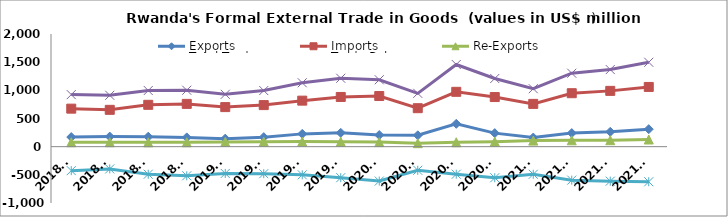
| Category | Exports | Imports | Re-Exports | Total Trade | Trade Balance |
|---|---|---|---|---|---|
| 2018Q1 | 170.799 | 674.777 | 78.5 | 924.075 | -425.479 |
| 2018Q2 | 179.196 | 653.691 | 79.205 | 912.093 | -395.289 |
| 2018Q3 | 176.56 | 742.86 | 77.118 | 996.538 | -489.182 |
| 2018Q4 | 164.223 | 759.496 | 78.239 | 1001.958 | -517.034 |
| 2019Q1 | 142.226 | 702.457 | 84.537 | 929.22 | -475.694 |
| 2019Q2 | 168.991 | 737.888 | 89.17 | 996.048 | -479.727 |
| 2019Q3 | 226.991 | 816.871 | 90.481 | 1134.343 | -499.399 |
| 2019Q4 | 244.881 | 882.342 | 86.987 | 1214.21 | -550.474 |
| 2020Q1 | 206.757 | 898.996 | 81.633 | 1187.386 | -610.606 |
| 2020Q2 | 201.77 | 682.838 | 62.103 | 946.711 | -418.965 |
| 2020Q3 | 405.953 | 973.662 | 78.856 | 1458.471 | -488.853 |
| 2020Q4 | 240.244 | 880.636 | 89.074 | 1209.954 | -551.318 |
| 2021Q1 | 161.83 | 759.383 | 107.52 | 1028.733 | -490.033 |
| 2021Q2 | 241.484 | 948.948 | 113.328 | 1303.761 | -594.135 |
| 2021Q3 | 263.416 | 990.421 | 114.805 | 1368.643 | -612.2 |
| 2021Q4 | 310.514 | 1060.28 | 127.194 | 1497.988 | -622.572 |